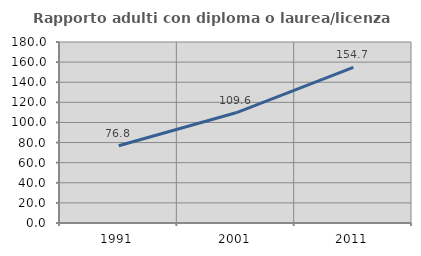
| Category | Rapporto adulti con diploma o laurea/licenza media  |
|---|---|
| 1991.0 | 76.813 |
| 2001.0 | 109.6 |
| 2011.0 | 154.715 |